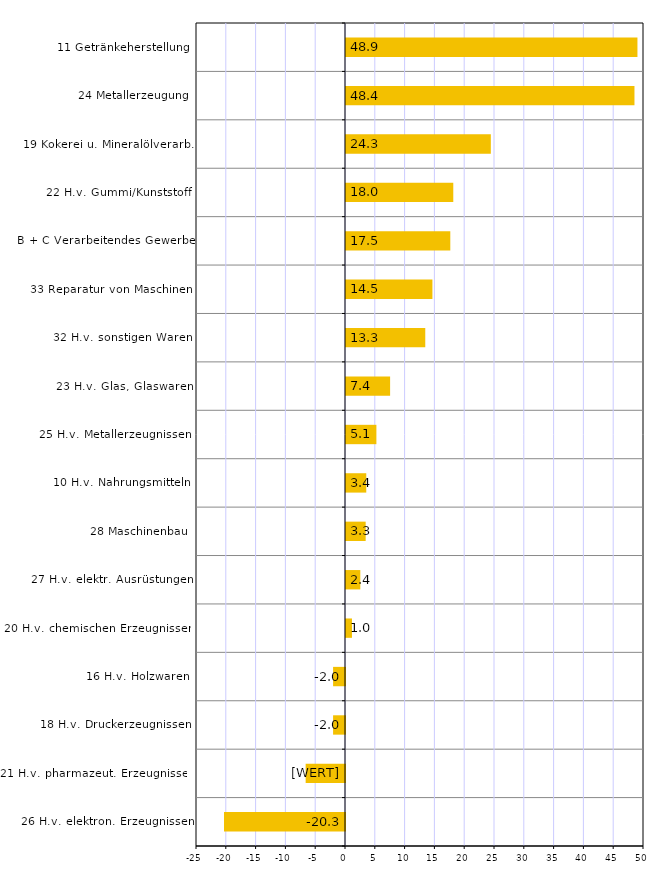
| Category | Series 2 |
|---|---|
| 26 H.v. elektron. Erzeugnissen | -20.3 |
| 21 H.v. pharmazeut. Erzeugnissen | -6.6 |
| 18 H.v. Druckerzeugnissen | -2 |
| 16 H.v. Holzwaren | -2 |
| 20 H.v. chemischen Erzeugnissen | 1 |
| 27 H.v. elektr. Ausrüstungen | 2.4 |
| 28 Maschinenbau | 3.3 |
| 10 H.v. Nahrungsmitteln | 3.4 |
| 25 H.v. Metallerzeugnissen | 5.1 |
| 23 H.v. Glas, Glaswaren | 7.4 |
| 32 H.v. sonstigen Waren | 13.3 |
| 33 Reparatur von Maschinen | 14.5 |
| B + C Verarbeitendes Gewerbe | 17.5 |
| 22 H.v. Gummi/Kunststoff | 18 |
| 19 Kokerei u. Mineralölverarb. | 24.3 |
| 24 Metallerzeugung | 48.4 |
| 11 Getränkeherstellung | 48.9 |